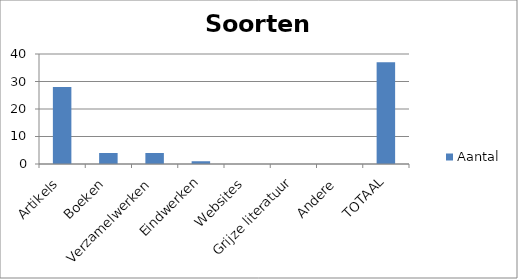
| Category | Aantal |
|---|---|
| Artikels | 28 |
| Boeken | 4 |
| Verzamelwerken | 4 |
| Eindwerken | 1 |
| Websites | 0 |
| Grijze literatuur | 0 |
| Andere | 0 |
| TOTAAL | 37 |